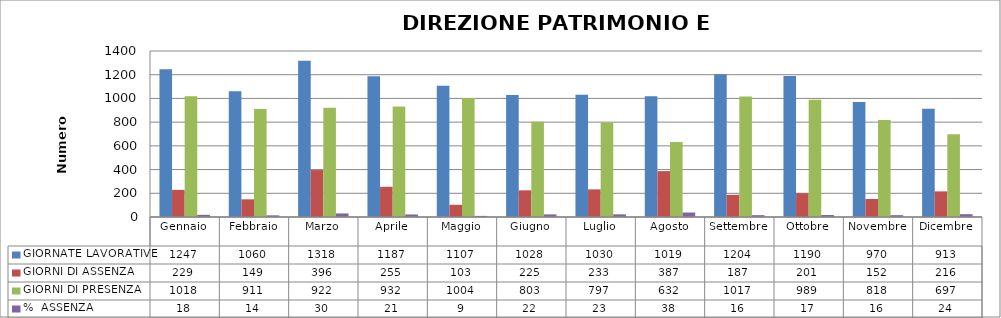
| Category | GIORNATE LAVORATIVE | GIORNI DI ASSENZA | GIORNI DI PRESENZA | %  ASSENZA |
|---|---|---|---|---|
| Gennaio | 1247 | 229 | 1018 | 18.364 |
| Febbraio | 1060 | 149 | 911 | 14.057 |
| Marzo | 1318 | 396 | 922 | 30.046 |
| Aprile | 1187 | 255 | 932 | 21.483 |
| Maggio | 1107 | 103 | 1004 | 9.304 |
| Giugno | 1028 | 225 | 803 | 21.887 |
| Luglio | 1030 | 233 | 797 | 22.621 |
| Agosto | 1019 | 387 | 632 | 37.978 |
| Settembre | 1204 | 187 | 1017 | 15.532 |
| Ottobre | 1190 | 201 | 989 | 16.891 |
| Novembre | 970 | 152 | 818 | 15.67 |
| Dicembre | 913 | 216 | 697 | 23.658 |